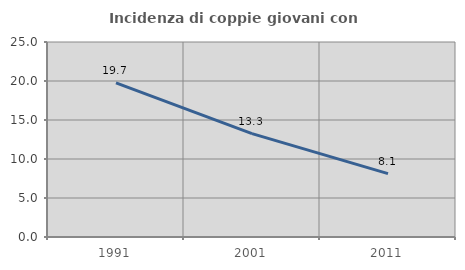
| Category | Incidenza di coppie giovani con figli |
|---|---|
| 1991.0 | 19.749 |
| 2001.0 | 13.257 |
| 2011.0 | 8.121 |